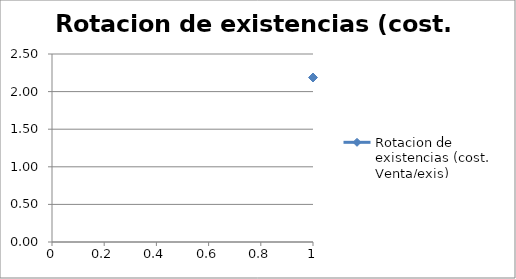
| Category | Rotacion de existencias (cost. Venta/exis) |
|---|---|
| 0 | 2.187 |
| 1 | 1.538 |
| 2 | 1.56 |
| 3 | 1.492 |
| 4 | 1.212 |
| 5 | 1.698 |
| 6 | 1.541 |
| 7 | 1.649 |